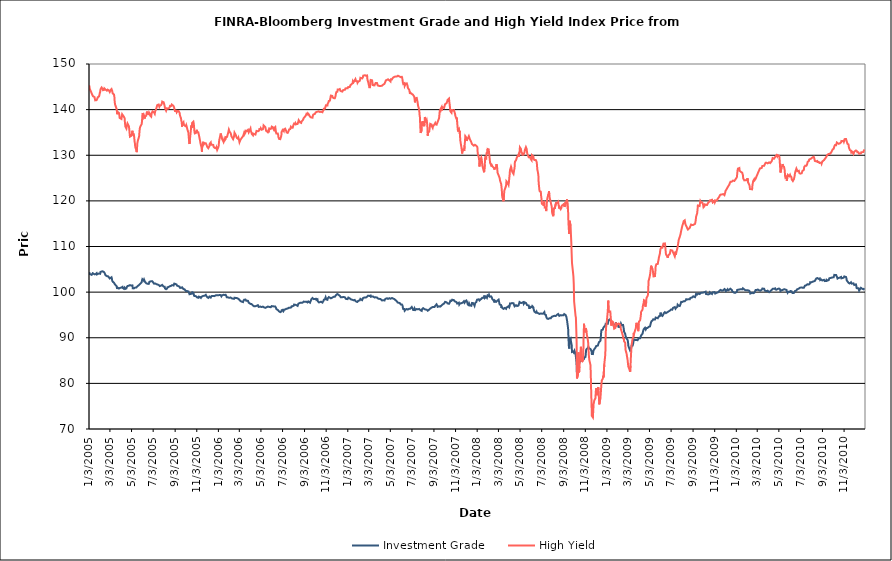
| Category | Investment Grade | High Yield |
|---|---|---|
| 1/3/05 | 104.343 | 145.319 |
| 1/4/05 | 104.16 | 145.238 |
| 1/5/05 | 103.953 | 144.493 |
| 1/6/05 | 103.965 | 144.467 |
| 1/7/05 | 103.905 | 144.3 |
| 1/10/05 | 103.794 | 143.584 |
| 1/11/05 | 103.889 | 143.363 |
| 1/12/05 | 103.941 | 143.402 |
| 1/13/05 | 104.147 | 143.307 |
| 1/14/05 | 104.036 | 142.917 |
| 1/18/05 | 103.9 | 142.755 |
| 1/19/05 | 103.971 | 142.839 |
| 1/20/05 | 103.872 | 142.037 |
| 1/21/05 | 103.955 | 142.079 |
| 1/24/05 | 104.155 | 142.083 |
| 1/25/05 | 103.882 | 142.243 |
| 1/26/05 | 103.91 | 142.393 |
| 1/27/05 | 103.804 | 142.681 |
| 1/28/05 | 104.02 | 142.831 |
| 1/31/05 | 104.076 | 142.911 |
| 2/1/05 | 104.105 | 143.28 |
| 2/2/05 | 104.086 | 143.652 |
| 2/3/05 | 104.023 | 143.894 |
| 2/4/05 | 104.432 | 144.453 |
| 2/7/05 | 104.534 | 144.856 |
| 2/8/05 | 104.605 | 145.058 |
| 2/9/05 | 104.703 | 144.888 |
| 2/10/05 | 104.553 | 144.576 |
| 2/11/05 | 104.372 | 144.26 |
| 2/14/05 | 104.388 | 144.325 |
| 2/15/05 | 104.316 | 144.638 |
| 2/16/05 | 104.11 | 144.653 |
| 2/17/05 | 104.001 | 144.691 |
| 2/18/05 | 103.711 | 144.428 |
| 2/22/05 | 103.506 | 144.154 |
| 2/23/05 | 103.591 | 144.264 |
| 2/24/05 | 103.55 | 144.379 |
| 2/25/05 | 103.494 | 144.395 |
| 2/28/05 | 103.216 | 144.178 |
| 3/1/05 | 103.056 | 143.99 |
| 3/2/05 | 102.987 | 143.881 |
| 3/3/05 | 103.029 | 144.062 |
| 3/4/05 | 103.116 | 144.252 |
| 3/7/05 | 103.25 | 144.509 |
| 3/8/05 | 102.962 | 144.692 |
| 3/9/05 | 102.474 | 144.096 |
| 3/10/05 | 102.35 | 143.614 |
| 3/11/05 | 102.247 | 143.544 |
| 3/14/05 | 102.07 | 143.289 |
| 3/15/05 | 102.076 | 142.877 |
| 3/16/05 | 101.771 | 141.686 |
| 3/17/05 | 101.795 | 141.163 |
| 3/18/05 | 101.648 | 141.33 |
| 3/21/05 | 101.327 | 140.239 |
| 3/22/05 | 101.163 | 139.79 |
| 3/23/05 | 100.692 | 138.992 |
| 3/24/05 | 100.993 | 139.53 |
| 3/28/05 | 100.794 | 139.271 |
| 3/29/05 | 100.755 | 138.872 |
| 3/30/05 | 100.79 | 138.18 |
| 3/31/05 | 100.924 | 138.075 |
| 4/1/05 | 101.005 | 138.121 |
| 4/4/05 | 100.997 | 137.948 |
| 4/5/05 | 101.011 | 138.478 |
| 4/6/05 | 101.142 | 138.984 |
| 4/7/05 | 101.153 | 139.179 |
| 4/8/05 | 100.905 | 138.973 |
| 4/11/05 | 100.728 | 138.447 |
| 4/12/05 | 100.833 | 138.264 |
| 4/13/05 | 100.987 | 138.087 |
| 4/14/05 | 100.848 | 137.054 |
| 4/15/05 | 100.719 | 136.307 |
| 4/18/05 | 100.819 | 135.863 |
| 4/19/05 | 101.064 | 136.344 |
| 4/20/05 | 101.222 | 136.698 |
| 4/21/05 | 101.333 | 136.97 |
| 4/22/05 | 101.438 | 136.784 |
| 4/25/05 | 101.411 | 136.346 |
| 4/26/05 | 101.292 | 135.795 |
| 4/27/05 | 101.393 | 134.855 |
| 4/28/05 | 101.534 | 134.082 |
| 4/29/05 | 101.518 | 133.92 |
| 5/2/05 | 101.434 | 134.257 |
| 5/3/05 | 101.437 | 134.479 |
| 5/4/05 | 101.517 | 134.874 |
| 5/5/05 | 101.474 | 135.374 |
| 5/6/05 | 100.841 | 134.515 |
| 5/9/05 | 100.817 | 134.576 |
| 5/10/05 | 100.958 | 133.973 |
| 5/11/05 | 101.002 | 133.106 |
| 5/12/05 | 100.982 | 132.594 |
| 5/13/05 | 100.991 | 131.802 |
| 5/16/05 | 100.997 | 131.095 |
| 5/17/05 | 100.968 | 130.681 |
| 5/18/05 | 101.209 | 131.588 |
| 5/19/05 | 101.278 | 132.647 |
| 5/20/05 | 101.283 | 133.102 |
| 5/23/05 | 101.524 | 133.904 |
| 5/24/05 | 101.56 | 134.234 |
| 5/25/05 | 101.682 | 135.291 |
| 5/26/05 | 101.75 | 135.927 |
| 5/27/05 | 101.884 | 136.236 |
| 5/31/05 | 102.135 | 136.819 |
| 6/1/05 | 102.564 | 137.407 |
| 6/2/05 | 102.824 | 138.734 |
| 6/3/05 | 102.759 | 139.268 |
| 6/6/05 | 102.485 | 138.39 |
| 6/7/05 | 102.722 | 138.651 |
| 6/8/05 | 102.605 | 138.419 |
| 6/9/05 | 102.331 | 138.056 |
| 6/10/05 | 102.181 | 138.523 |
| 6/13/05 | 101.942 | 138.668 |
| 6/14/05 | 101.869 | 139.172 |
| 6/15/05 | 101.82 | 139.575 |
| 6/16/05 | 101.844 | 139.078 |
| 6/17/05 | 101.944 | 139.134 |
| 6/20/05 | 101.804 | 138.985 |
| 6/21/05 | 101.971 | 139.358 |
| 6/22/05 | 102.258 | 139.44 |
| 6/23/05 | 102.224 | 139.083 |
| 6/24/05 | 102.29 | 138.705 |
| 6/27/05 | 102.4 | 138.474 |
| 6/28/05 | 102.305 | 139.087 |
| 6/29/05 | 102.305 | 139.337 |
| 6/30/05 | 102.402 | 139.466 |
| 7/1/05 | 102.272 | 139.626 |
| 7/5/05 | 101.849 | 139.378 |
| 7/6/05 | 101.878 | 139.345 |
| 7/7/05 | 102.04 | 139.091 |
| 7/8/05 | 101.907 | 139.585 |
| 7/11/05 | 101.773 | 140.154 |
| 7/12/05 | 101.766 | 140.43 |
| 7/13/05 | 101.644 | 140.407 |
| 7/14/05 | 101.677 | 140.998 |
| 7/15/05 | 101.633 | 141.09 |
| 7/18/05 | 101.59 | 141.117 |
| 7/19/05 | 101.526 | 140.91 |
| 7/20/05 | 101.5 | 140.611 |
| 7/21/05 | 101.33 | 140.778 |
| 7/22/05 | 101.432 | 140.902 |
| 7/25/05 | 101.437 | 140.996 |
| 7/26/05 | 101.403 | 141.12 |
| 7/27/05 | 101.39 | 141.347 |
| 7/28/05 | 101.579 | 141.763 |
| 7/29/05 | 101.463 | 141.838 |
| 8/1/05 | 101.202 | 141.62 |
| 8/2/05 | 101.174 | 141.521 |
| 8/3/05 | 101.163 | 141.075 |
| 8/4/05 | 101.172 | 140.984 |
| 8/5/05 | 100.786 | 140.33 |
| 8/8/05 | 100.645 | 139.783 |
| 8/9/05 | 100.599 | 139.917 |
| 8/10/05 | 100.742 | 140.274 |
| 8/11/05 | 100.806 | 140.187 |
| 8/12/05 | 101.068 | 140.232 |
| 8/15/05 | 101.123 | 140.269 |
| 8/16/05 | 101.264 | 140.227 |
| 8/17/05 | 101.171 | 140.27 |
| 8/18/05 | 101.27 | 140.515 |
| 8/19/05 | 101.292 | 140.821 |
| 8/22/05 | 101.371 | 140.818 |
| 8/23/05 | 101.482 | 140.994 |
| 8/24/05 | 101.47 | 141.119 |
| 8/25/05 | 101.538 | 141.139 |
| 8/26/05 | 101.472 | 141.246 |
| 8/29/05 | 101.447 | 140.777 |
| 8/30/05 | 101.539 | 140.657 |
| 8/31/05 | 101.866 | 140.362 |
| 9/1/05 | 101.904 | 139.957 |
| 9/2/05 | 101.902 | 139.694 |
| 9/6/05 | 101.702 | 139.738 |
| 9/7/05 | 101.484 | 139.424 |
| 9/8/05 | 101.412 | 139.603 |
| 9/9/05 | 101.507 | 139.675 |
| 9/12/05 | 101.289 | 139.702 |
| 9/13/05 | 101.436 | 139.589 |
| 9/14/05 | 101.41 | 139.7 |
| 9/15/05 | 101.198 | 139.326 |
| 9/16/05 | 100.947 | 138.769 |
| 9/19/05 | 100.92 | 138.093 |
| 9/20/05 | 100.822 | 137.577 |
| 9/21/05 | 101.051 | 137.279 |
| 9/22/05 | 101.06 | 136.264 |
| 9/23/05 | 100.888 | 136.991 |
| 9/26/05 | 100.662 | 137.266 |
| 9/27/05 | 100.587 | 136.765 |
| 9/28/05 | 100.636 | 136.654 |
| 9/29/05 | 100.615 | 136.516 |
| 9/30/05 | 100.474 | 136.425 |
| 10/3/05 | 100.22 | 136.319 |
| 10/4/05 | 100.251 | 136.573 |
| 10/5/05 | 100.289 | 136.315 |
| 10/6/05 | 100.233 | 136.152 |
| 10/7/05 | 100.127 | 135.697 |
| 10/10/05 | 100.145 | 134.892 |
| 10/11/05 | 100.026 | 133.876 |
| 10/12/05 | 99.822 | 132.974 |
| 10/13/05 | 99.537 | 132.463 |
| 10/14/05 | 99.464 | 133.309 |
| 10/17/05 | 99.614 | 135.611 |
| 10/18/05 | 99.713 | 136.523 |
| 10/19/05 | 99.754 | 135.961 |
| 10/20/05 | 99.661 | 136.123 |
| 10/21/05 | 99.956 | 137.128 |
| 10/24/05 | 99.836 | 137.356 |
| 10/25/05 | 99.592 | 136.993 |
| 10/26/05 | 99.18 | 136.092 |
| 10/27/05 | 99.14 | 135.099 |
| 10/28/05 | 99.125 | 134.797 |
| 10/31/05 | 99.119 | 134.881 |
| 11/1/05 | 99.121 | 135.143 |
| 11/2/05 | 98.98 | 135.174 |
| 11/3/05 | 98.854 | 135.576 |
| 11/4/05 | 98.764 | 135.017 |
| 11/7/05 | 98.766 | 134.988 |
| 11/8/05 | 99.01 | 134.818 |
| 11/9/05 | 98.804 | 134.245 |
| 11/10/05 | 98.864 | 134.131 |
| 11/11/05 | 98.953 | 134.291 |
| 11/14/05 | 98.73 | 132.27 |
| 11/15/05 | 98.801 | 132.254 |
| 11/16/05 | 98.997 | 131.705 |
| 11/17/05 | 99.065 | 130.783 |
| 11/18/05 | 99.041 | 132.286 |
| 11/21/05 | 99.171 | 132.957 |
| 11/22/05 | 99.212 | 132.367 |
| 11/23/05 | 99.198 | 132.411 |
| 11/25/05 | 99.235 | 132.644 |
| 11/28/05 | 99.42 | 132.63 |
| 11/29/05 | 99.257 | 132.62 |
| 11/30/05 | 99.115 | 132.297 |
| 12/1/05 | 98.992 | 132.407 |
| 12/2/05 | 98.894 | 131.85 |
| 12/5/05 | 98.733 | 131.549 |
| 12/6/05 | 98.856 | 131.356 |
| 12/7/05 | 98.834 | 131.464 |
| 12/8/05 | 99.024 | 131.968 |
| 12/9/05 | 98.906 | 132.51 |
| 12/12/05 | 98.804 | 132.801 |
| 12/13/05 | 98.83 | 132.291 |
| 12/14/05 | 99.128 | 132.316 |
| 12/15/05 | 99.066 | 132.169 |
| 12/16/05 | 99.224 | 132.304 |
| 12/19/05 | 99.169 | 132.267 |
| 12/20/05 | 99.075 | 131.868 |
| 12/21/05 | 98.95 | 131.72 |
| 12/22/05 | 99.125 | 131.704 |
| 12/23/05 | 99.216 | 131.622 |
| 12/27/05 | 99.333 | 131.516 |
| 12/28/05 | 99.401 | 131.738 |
| 12/29/05 | 99.364 | 131.468 |
| 12/30/05 | 99.341 | 131.173 |
| 1/3/06 | 99.332 | 131.91 |
| 1/4/06 | 99.423 | 132.671 |
| 1/5/06 | 99.426 | 133.413 |
| 1/6/06 | 99.355 | 133.643 |
| 1/9/06 | 99.342 | 134.769 |
| 1/10/06 | 99.168 | 134.514 |
| 1/11/06 | 99.068 | 134.516 |
| 1/12/06 | 99.117 | 134.05 |
| 1/13/06 | 99.303 | 133.555 |
| 1/17/06 | 99.418 | 132.919 |
| 1/18/06 | 99.47 | 132.896 |
| 1/19/06 | 99.38 | 133.5 |
| 1/20/06 | 99.385 | 133.224 |
| 1/23/06 | 99.412 | 133.552 |
| 1/24/06 | 99.361 | 134.001 |
| 1/25/06 | 99.136 | 134.216 |
| 1/26/06 | 98.879 | 133.879 |
| 1/27/06 | 98.914 | 134.031 |
| 1/30/06 | 98.837 | 134.921 |
| 1/31/06 | 98.854 | 135.056 |
| 2/1/06 | 98.784 | 135.605 |
| 2/2/06 | 98.763 | 135.593 |
| 2/3/06 | 98.724 | 135.146 |
| 2/6/06 | 98.816 | 134.868 |
| 2/7/06 | 98.733 | 134.621 |
| 2/8/06 | 98.645 | 134.208 |
| 2/9/06 | 98.64 | 134.181 |
| 2/10/06 | 98.662 | 134.009 |
| 2/13/06 | 98.555 | 133.522 |
| 2/14/06 | 98.484 | 133.371 |
| 2/15/06 | 98.517 | 133.944 |
| 2/16/06 | 98.548 | 134.37 |
| 2/17/06 | 98.771 | 134.946 |
| 2/21/06 | 98.715 | 134.36 |
| 2/22/06 | 98.754 | 134.06 |
| 2/23/06 | 98.712 | 133.867 |
| 2/24/06 | 98.69 | 133.755 |
| 2/27/06 | 98.58 | 133.591 |
| 2/28/06 | 98.7 | 133.818 |
| 3/1/06 | 98.619 | 133.744 |
| 3/2/06 | 98.393 | 133.236 |
| 3/3/06 | 98.233 | 132.854 |
| 3/6/06 | 98.027 | 133.424 |
| 3/7/06 | 97.9 | 133.306 |
| 3/8/06 | 97.914 | 133.36 |
| 3/9/06 | 97.925 | 133.753 |
| 3/10/06 | 97.826 | 133.911 |
| 3/13/06 | 97.825 | 134.181 |
| 3/14/06 | 98.069 | 134.261 |
| 3/15/06 | 98.031 | 134.615 |
| 3/16/06 | 98.334 | 134.881 |
| 3/17/06 | 98.304 | 134.585 |
| 3/20/06 | 98.374 | 134.992 |
| 3/21/06 | 98.16 | 135.372 |
| 3/22/06 | 98.121 | 135.408 |
| 3/23/06 | 98.025 | 135.266 |
| 3/24/06 | 98.152 | 135.325 |
| 3/27/06 | 98.086 | 135.566 |
| 3/28/06 | 97.884 | 135.439 |
| 3/29/06 | 97.681 | 135.023 |
| 3/30/06 | 97.491 | 135.011 |
| 3/31/06 | 97.495 | 135.344 |
| 4/3/06 | 97.42 | 135.864 |
| 4/4/06 | 97.477 | 135.367 |
| 4/5/06 | 97.561 | 135.307 |
| 4/6/06 | 97.382 | 134.94 |
| 4/7/06 | 97.167 | 134.616 |
| 4/10/06 | 97.082 | 134.377 |
| 4/11/06 | 97.195 | 134.732 |
| 4/12/06 | 97.139 | 134.682 |
| 4/13/06 | 96.899 | 134.528 |
| 4/17/06 | 96.918 | 134.532 |
| 4/18/06 | 97.079 | 134.825 |
| 4/19/06 | 96.987 | 135.023 |
| 4/20/06 | 96.989 | 135.333 |
| 4/21/06 | 97.03 | 135.37 |
| 4/24/06 | 97.134 | 135.246 |
| 4/25/06 | 96.925 | 135.13 |
| 4/26/06 | 96.768 | 135.162 |
| 4/27/06 | 96.868 | 135.4 |
| 4/28/06 | 96.956 | 135.727 |
| 5/1/06 | 96.839 | 135.689 |
| 5/2/06 | 96.897 | 135.92 |
| 5/3/06 | 96.782 | 135.783 |
| 5/4/06 | 96.728 | 135.594 |
| 5/5/06 | 96.852 | 135.628 |
| 5/8/06 | 96.821 | 135.7 |
| 5/9/06 | 96.771 | 135.944 |
| 5/10/06 | 96.85 | 136.533 |
| 5/11/06 | 96.666 | 136.702 |
| 5/12/06 | 96.512 | 136.451 |
| 5/15/06 | 96.56 | 136.151 |
| 5/16/06 | 96.663 | 135.992 |
| 5/17/06 | 96.444 | 135.376 |
| 5/18/06 | 96.661 | 135.253 |
| 5/19/06 | 96.809 | 135.488 |
| 5/22/06 | 96.842 | 135.04 |
| 5/23/06 | 96.721 | 135.278 |
| 5/24/06 | 96.817 | 135.015 |
| 5/25/06 | 96.772 | 135.527 |
| 5/26/06 | 96.824 | 135.874 |
| 5/30/06 | 96.702 | 135.75 |
| 5/31/06 | 96.557 | 135.857 |
| 6/1/06 | 96.521 | 135.974 |
| 6/2/06 | 96.939 | 136.277 |
| 6/5/06 | 96.909 | 136.162 |
| 6/6/06 | 96.825 | 135.866 |
| 6/7/06 | 96.792 | 136.05 |
| 6/8/06 | 96.861 | 135.592 |
| 6/9/06 | 96.9 | 135.922 |
| 6/12/06 | 96.861 | 136.181 |
| 6/13/06 | 96.87 | 135.599 |
| 6/14/06 | 96.555 | 135.028 |
| 6/15/06 | 96.273 | 134.781 |
| 6/16/06 | 96.267 | 134.748 |
| 6/19/06 | 96.104 | 134.776 |
| 6/20/06 | 96.031 | 134.452 |
| 6/21/06 | 95.986 | 133.884 |
| 6/22/06 | 95.822 | 133.84 |
| 6/23/06 | 95.681 | 133.56 |
| 6/26/06 | 95.62 | 133.532 |
| 6/27/06 | 95.703 | 133.65 |
| 6/28/06 | 95.641 | 133.654 |
| 6/29/06 | 95.747 | 134.285 |
| 6/30/06 | 96.039 | 135.161 |
| 7/3/06 | 96.128 | 135.559 |
| 7/5/06 | 95.843 | 135.346 |
| 7/6/06 | 95.945 | 135.276 |
| 7/7/06 | 96.141 | 135.692 |
| 7/10/06 | 96.214 | 135.821 |
| 7/11/06 | 96.32 | 135.822 |
| 7/12/06 | 96.254 | 135.806 |
| 7/13/06 | 96.347 | 135.251 |
| 7/14/06 | 96.422 | 134.996 |
| 7/17/06 | 96.402 | 134.909 |
| 7/18/06 | 96.209 | 134.957 |
| 7/19/06 | 96.395 | 135.186 |
| 7/20/06 | 96.565 | 135.327 |
| 7/21/06 | 96.664 | 135.653 |
| 7/24/06 | 96.596 | 135.738 |
| 7/25/06 | 96.491 | 135.87 |
| 7/26/06 | 96.567 | 136.235 |
| 7/27/06 | 96.661 | 136.224 |
| 7/28/06 | 96.883 | 136.006 |
| 7/31/06 | 96.92 | 136.009 |
| 8/1/06 | 96.923 | 136.092 |
| 8/2/06 | 97.018 | 136.603 |
| 8/3/06 | 97.027 | 136.449 |
| 8/4/06 | 97.267 | 136.938 |
| 8/7/06 | 97.242 | 136.797 |
| 8/8/06 | 97.219 | 137.055 |
| 8/9/06 | 97.171 | 137.159 |
| 8/10/06 | 97.157 | 136.8 |
| 8/11/06 | 97.085 | 136.829 |
| 8/14/06 | 96.986 | 136.863 |
| 8/15/06 | 97.202 | 137.078 |
| 8/16/06 | 97.457 | 137.409 |
| 8/17/06 | 97.521 | 137.686 |
| 8/18/06 | 97.558 | 137.545 |
| 8/21/06 | 97.648 | 137.195 |
| 8/22/06 | 97.662 | 137.044 |
| 8/23/06 | 97.61 | 137.088 |
| 8/24/06 | 97.665 | 137.091 |
| 8/25/06 | 97.746 | 137.394 |
| 8/28/06 | 97.693 | 137.636 |
| 8/29/06 | 97.604 | 137.617 |
| 8/30/06 | 97.793 | 137.88 |
| 8/31/06 | 97.923 | 138.137 |
| 9/1/06 | 97.951 | 138.244 |
| 9/5/06 | 97.876 | 138.577 |
| 9/6/06 | 97.691 | 138.719 |
| 9/7/06 | 97.739 | 138.856 |
| 9/8/06 | 97.887 | 139.096 |
| 9/11/06 | 97.742 | 138.947 |
| 9/12/06 | 97.779 | 139.175 |
| 9/13/06 | 97.963 | 139.285 |
| 9/14/06 | 97.871 | 139.265 |
| 9/15/06 | 97.82 | 138.905 |
| 9/18/06 | 97.678 | 138.451 |
| 9/19/06 | 97.913 | 138.516 |
| 9/20/06 | 98.04 | 138.56 |
| 9/21/06 | 98.243 | 138.289 |
| 9/22/06 | 98.489 | 138.323 |
| 9/25/06 | 98.722 | 138.238 |
| 9/26/06 | 98.656 | 138.667 |
| 9/27/06 | 98.611 | 138.912 |
| 9/28/06 | 98.47 | 138.841 |
| 9/29/06 | 98.438 | 139.002 |
| 10/2/06 | 98.507 | 139.074 |
| 10/3/06 | 98.491 | 138.914 |
| 10/4/06 | 98.652 | 139.406 |
| 10/5/06 | 98.543 | 139.481 |
| 10/6/06 | 98.307 | 139.486 |
| 10/9/06 | 98.423 | 139.553 |
| 10/10/06 | 97.968 | 139.383 |
| 10/11/06 | 97.902 | 139.542 |
| 10/12/06 | 97.87 | 139.631 |
| 10/13/06 | 97.745 | 139.615 |
| 10/16/06 | 97.818 | 139.487 |
| 10/17/06 | 97.981 | 139.484 |
| 10/18/06 | 97.951 | 139.527 |
| 10/19/06 | 97.902 | 139.555 |
| 10/20/06 | 97.849 | 139.49 |
| 10/23/06 | 97.705 | 139.428 |
| 10/24/06 | 97.702 | 139.652 |
| 10/25/06 | 97.832 | 139.615 |
| 10/26/06 | 98.1 | 139.885 |
| 10/27/06 | 98.343 | 140.207 |
| 10/30/06 | 98.414 | 140.217 |
| 10/31/06 | 98.608 | 140.355 |
| 11/1/06 | 98.868 | 140.745 |
| 11/2/06 | 98.822 | 140.965 |
| 11/3/06 | 98.398 | 140.89 |
| 11/6/06 | 98.326 | 140.907 |
| 11/7/06 | 98.651 | 141.33 |
| 11/8/06 | 98.65 | 141.296 |
| 11/9/06 | 98.743 | 141.59 |
| 11/10/06 | 98.913 | 141.896 |
| 11/13/06 | 98.785 | 141.972 |
| 11/14/06 | 98.925 | 142.35 |
| 11/15/06 | 98.775 | 142.827 |
| 11/16/06 | 98.642 | 143.086 |
| 11/17/06 | 98.773 | 143.029 |
| 11/20/06 | 98.814 | 142.99 |
| 11/21/06 | 98.865 | 142.652 |
| 11/22/06 | 98.981 | 142.508 |
| 11/24/06 | 98.982 | 142.519 |
| 11/27/06 | 98.979 | 142.501 |
| 11/28/06 | 99.161 | 142.411 |
| 11/29/06 | 99.192 | 142.998 |
| 11/30/06 | 99.326 | 143.488 |
| 12/1/06 | 99.534 | 143.821 |
| 12/4/06 | 99.584 | 143.934 |
| 12/5/06 | 99.621 | 144.395 |
| 12/6/06 | 99.503 | 144.546 |
| 12/7/06 | 99.429 | 144.572 |
| 12/8/06 | 99.245 | 144.394 |
| 12/11/06 | 99.204 | 144.516 |
| 12/12/06 | 99.271 | 144.445 |
| 12/13/06 | 99.022 | 144.098 |
| 12/14/06 | 98.856 | 143.879 |
| 12/15/06 | 98.982 | 144.131 |
| 12/18/06 | 98.88 | 143.954 |
| 12/19/06 | 98.899 | 144.126 |
| 12/20/06 | 98.874 | 144.255 |
| 12/21/06 | 98.943 | 144.438 |
| 12/22/06 | 98.87 | 144.462 |
| 12/26/06 | 98.839 | 144.384 |
| 12/27/06 | 98.696 | 144.657 |
| 12/28/06 | 98.533 | 144.677 |
| 12/29/06 | 98.449 | 144.601 |
| 1/2/07 | 98.465 | 144.668 |
| 1/3/07 | 98.587 | 144.92 |
| 1/4/07 | 98.809 | 144.932 |
| 1/5/07 | 98.665 | 144.953 |
| 1/8/07 | 98.638 | 144.962 |
| 1/9/07 | 98.658 | 145.135 |
| 1/10/07 | 98.552 | 145.368 |
| 1/11/07 | 98.416 | 145.398 |
| 1/12/07 | 98.198 | 145.502 |
| 1/16/07 | 98.31 | 145.767 |
| 1/17/07 | 98.281 | 146.259 |
| 1/18/07 | 98.233 | 146.131 |
| 1/19/07 | 98.211 | 146.012 |
| 1/22/07 | 98.289 | 146.407 |
| 1/23/07 | 98.217 | 146.58 |
| 1/24/07 | 98.167 | 146.695 |
| 1/25/07 | 97.99 | 146.531 |
| 1/26/07 | 97.867 | 146.244 |
| 1/29/07 | 97.85 | 146.217 |
| 1/30/07 | 97.836 | 145.879 |
| 1/31/07 | 97.925 | 145.748 |
| 2/1/07 | 98.081 | 146.134 |
| 2/2/07 | 98.126 | 146.246 |
| 2/5/07 | 98.191 | 146.298 |
| 2/6/07 | 98.308 | 146.519 |
| 2/7/07 | 98.518 | 146.972 |
| 2/8/07 | 98.51 | 146.816 |
| 2/9/07 | 98.362 | 147.071 |
| 2/12/07 | 98.248 | 146.834 |
| 2/13/07 | 98.172 | 146.779 |
| 2/14/07 | 98.461 | 147.057 |
| 2/15/07 | 98.75 | 147.448 |
| 2/16/07 | 98.821 | 147.477 |
| 2/20/07 | 98.847 | 147.545 |
| 2/21/07 | 98.819 | 147.704 |
| 2/22/07 | 98.693 | 147.746 |
| 2/23/07 | 98.834 | 147.43 |
| 2/26/07 | 99.001 | 147.489 |
| 2/27/07 | 99.183 | 146.525 |
| 2/28/07 | 99.173 | 146.557 |
| 3/1/07 | 99.224 | 146.088 |
| 3/2/07 | 99.245 | 145.71 |
| 3/5/07 | 99.16 | 144.718 |
| 3/6/07 | 99.097 | 144.993 |
| 3/7/07 | 99.186 | 145.827 |
| 3/8/07 | 99.252 | 146.502 |
| 3/9/07 | 98.98 | 146.547 |
| 3/12/07 | 99.061 | 146.431 |
| 3/13/07 | 99.17 | 145.894 |
| 3/14/07 | 99.06 | 145.169 |
| 3/15/07 | 99.029 | 145.458 |
| 3/16/07 | 98.968 | 145.336 |
| 3/19/07 | 98.828 | 145.335 |
| 3/20/07 | 98.868 | 145.292 |
| 3/21/07 | 98.881 | 145.535 |
| 3/22/07 | 98.865 | 145.832 |
| 3/23/07 | 98.777 | 145.939 |
| 3/26/07 | 98.811 | 145.819 |
| 3/27/07 | 98.702 | 145.639 |
| 3/28/07 | 98.711 | 145.296 |
| 3/29/07 | 98.576 | 145.353 |
| 3/30/07 | 98.488 | 145.321 |
| 4/2/07 | 98.518 | 145.174 |
| 4/3/07 | 98.453 | 145.217 |
| 4/4/07 | 98.487 | 144.999 |
| 4/5/07 | 98.486 | 145.174 |
| 4/9/07 | 98.159 | 145.244 |
| 4/10/07 | 98.258 | 145.27 |
| 4/11/07 | 98.306 | 145.459 |
| 4/12/07 | 98.24 | 145.454 |
| 4/13/07 | 98.118 | 145.498 |
| 4/16/07 | 98.168 | 145.666 |
| 4/17/07 | 98.395 | 145.866 |
| 4/18/07 | 98.583 | 146.01 |
| 4/19/07 | 98.595 | 146.154 |
| 4/20/07 | 98.571 | 146.415 |
| 4/23/07 | 98.656 | 146.507 |
| 4/24/07 | 98.774 | 146.539 |
| 4/25/07 | 98.679 | 146.501 |
| 4/26/07 | 98.524 | 146.652 |
| 4/27/07 | 98.432 | 146.533 |
| 4/30/07 | 98.673 | 146.379 |
| 5/1/07 | 98.646 | 146.282 |
| 5/2/07 | 98.654 | 146.44 |
| 5/3/07 | 98.552 | 146.149 |
| 5/4/07 | 98.693 | 146.645 |
| 5/7/07 | 98.709 | 146.626 |
| 5/8/07 | 98.736 | 146.732 |
| 5/9/07 | 98.636 | 146.796 |
| 5/10/07 | 98.595 | 146.986 |
| 5/11/07 | 98.609 | 146.977 |
| 5/14/07 | 98.477 | 147.209 |
| 5/15/07 | 98.445 | 147.309 |
| 5/16/07 | 98.405 | 147.207 |
| 5/17/07 | 98.251 | 147.237 |
| 5/18/07 | 98.106 | 147.26 |
| 5/21/07 | 97.983 | 147.276 |
| 5/22/07 | 97.916 | 147.294 |
| 5/23/07 | 97.734 | 147.484 |
| 5/24/07 | 97.666 | 147.434 |
| 5/25/07 | 97.738 | 147.412 |
| 5/29/07 | 97.618 | 147.247 |
| 5/30/07 | 97.576 | 147.044 |
| 5/31/07 | 97.438 | 147.063 |
| 6/1/07 | 97.285 | 147.121 |
| 6/4/07 | 97.29 | 147.188 |
| 6/5/07 | 97.122 | 146.965 |
| 6/6/07 | 97.06 | 146.756 |
| 6/7/07 | 96.556 | 145.937 |
| 6/8/07 | 96.291 | 145.624 |
| 6/11/07 | 96.312 | 145.765 |
| 6/12/07 | 95.934 | 145.197 |
| 6/13/07 | 95.93 | 145.11 |
| 6/14/07 | 96.014 | 145.348 |
| 6/15/07 | 96.176 | 145.704 |
| 6/18/07 | 96.296 | 145.762 |
| 6/19/07 | 96.482 | 145.61 |
| 6/20/07 | 96.371 | 145.259 |
| 6/21/07 | 96.174 | 144.777 |
| 6/22/07 | 96.137 | 144.766 |
| 6/25/07 | 96.379 | 144.304 |
| 6/26/07 | 96.366 | 144.095 |
| 6/27/07 | 96.444 | 143.429 |
| 6/28/07 | 96.372 | 143.727 |
| 6/29/07 | 96.548 | 143.682 |
| 7/2/07 | 96.737 | 143.454 |
| 7/3/07 | 96.786 | 143.562 |
| 7/5/07 | 96.322 | 143.295 |
| 7/6/07 | 96.083 | 143.101 |
| 7/9/07 | 96.098 | 142.851 |
| 7/10/07 | 96.403 | 142.247 |
| 7/11/07 | 96.324 | 141.594 |
| 7/12/07 | 96.09 | 142.119 |
| 7/13/07 | 96.133 | 142.498 |
| 7/16/07 | 96.301 | 142.561 |
| 7/17/07 | 96.271 | 142.417 |
| 7/18/07 | 96.316 | 141.777 |
| 7/19/07 | 96.225 | 141.716 |
| 7/20/07 | 96.441 | 140.781 |
| 7/23/07 | 96.319 | 139.964 |
| 7/24/07 | 96.28 | 138.848 |
| 7/25/07 | 96.275 | 138.309 |
| 7/26/07 | 96.064 | 136.246 |
| 7/27/07 | 95.998 | 134.898 |
| 7/30/07 | 95.9 | 135.48 |
| 7/31/07 | 96.239 | 137.335 |
| 8/1/07 | 96.29 | 136.402 |
| 8/2/07 | 96.353 | 137.453 |
| 8/3/07 | 96.487 | 137.113 |
| 8/6/07 | 96.32 | 136.358 |
| 8/7/07 | 96.326 | 136.946 |
| 8/8/07 | 96.113 | 138.373 |
| 8/9/07 | 96.2 | 138.071 |
| 8/10/07 | 96.054 | 137.172 |
| 8/13/07 | 96.148 | 137.7 |
| 8/14/07 | 96.194 | 137.207 |
| 8/15/07 | 96.035 | 136.217 |
| 8/16/07 | 95.911 | 134.291 |
| 8/17/07 | 96.011 | 135.078 |
| 8/20/07 | 96.18 | 135.154 |
| 8/21/07 | 96.326 | 135.226 |
| 8/22/07 | 96.24 | 136.211 |
| 8/23/07 | 96.386 | 136.87 |
| 8/24/07 | 96.444 | 136.852 |
| 8/27/07 | 96.62 | 136.716 |
| 8/28/07 | 96.701 | 136.321 |
| 8/29/07 | 96.654 | 136.261 |
| 8/30/07 | 96.723 | 136.004 |
| 8/31/07 | 96.787 | 136.353 |
| 9/4/07 | 96.723 | 136.755 |
| 9/5/07 | 96.911 | 136.912 |
| 9/6/07 | 96.808 | 137.051 |
| 9/7/07 | 97.08 | 136.782 |
| 9/10/07 | 97.328 | 136.701 |
| 9/11/07 | 97.198 | 136.565 |
| 9/12/07 | 97.023 | 136.754 |
| 9/13/07 | 96.779 | 137.31 |
| 9/14/07 | 96.86 | 137.532 |
| 9/17/07 | 96.903 | 138.097 |
| 9/18/07 | 96.968 | 138.904 |
| 9/19/07 | 97.117 | 139.807 |
| 9/20/07 | 96.805 | 139.446 |
| 9/21/07 | 96.948 | 140.104 |
| 9/24/07 | 97.088 | 140.525 |
| 9/25/07 | 97.156 | 139.817 |
| 9/26/07 | 97.064 | 140.559 |
| 9/27/07 | 97.303 | 140.621 |
| 9/28/07 | 97.422 | 140.394 |
| 10/1/07 | 97.487 | 140.373 |
| 10/2/07 | 97.666 | 140.626 |
| 10/3/07 | 97.673 | 140.765 |
| 10/4/07 | 97.867 | 141.2 |
| 10/5/07 | 97.688 | 141.401 |
| 10/8/07 | 97.771 | 141.413 |
| 10/9/07 | 97.586 | 141.527 |
| 10/10/07 | 97.583 | 141.765 |
| 10/11/07 | 97.526 | 142.141 |
| 10/12/07 | 97.501 | 142.244 |
| 10/15/07 | 97.443 | 142.435 |
| 10/16/07 | 97.531 | 141.652 |
| 10/17/07 | 97.69 | 141.076 |
| 10/18/07 | 97.863 | 140.327 |
| 10/19/07 | 98.138 | 139.61 |
| 10/22/07 | 98.077 | 139.318 |
| 10/23/07 | 98.105 | 140.108 |
| 10/24/07 | 98.341 | 139.785 |
| 10/25/07 | 98.303 | 139.989 |
| 10/26/07 | 98.216 | 139.813 |
| 10/29/07 | 98.234 | 139.886 |
| 10/30/07 | 98.224 | 139.676 |
| 10/31/07 | 97.987 | 139.824 |
| 11/1/07 | 98.02 | 139.101 |
| 11/2/07 | 98.034 | 138.603 |
| 11/5/07 | 97.827 | 138.018 |
| 11/6/07 | 97.652 | 138.268 |
| 11/7/07 | 97.492 | 137.31 |
| 11/8/07 | 97.381 | 136.333 |
| 11/9/07 | 97.483 | 135.544 |
| 11/12/07 | 97.684 | 135.801 |
| 11/13/07 | 97.278 | 135.11 |
| 11/14/07 | 97.34 | 135.355 |
| 11/15/07 | 97.517 | 134.342 |
| 11/16/07 | 97.584 | 133.17 |
| 11/19/07 | 97.577 | 131.759 |
| 11/20/07 | 97.548 | 131.194 |
| 11/21/07 | 97.697 | 130.379 |
| 11/23/07 | 97.707 | 131.273 |
| 11/26/07 | 97.992 | 131.296 |
| 11/27/07 | 97.873 | 130.948 |
| 11/28/07 | 97.683 | 132.159 |
| 11/29/07 | 97.89 | 132.948 |
| 11/30/07 | 97.985 | 134.189 |
| 12/3/07 | 98.17 | 133.857 |
| 12/4/07 | 98.058 | 133.162 |
| 12/5/07 | 97.86 | 133.385 |
| 12/6/07 | 97.59 | 133.193 |
| 12/7/07 | 97.275 | 133.688 |
| 12/10/07 | 97.122 | 134.192 |
| 12/11/07 | 97.476 | 134.3 |
| 12/12/07 | 97.332 | 134.163 |
| 12/13/07 | 97.109 | 133.505 |
| 12/14/07 | 96.916 | 133.307 |
| 12/17/07 | 97.008 | 132.844 |
| 12/18/07 | 97.304 | 132.854 |
| 12/19/07 | 97.557 | 132.434 |
| 12/20/07 | 97.823 | 132.495 |
| 12/21/07 | 97.464 | 132.432 |
| 12/24/07 | 97.356 | 132.102 |
| 12/26/07 | 97.009 | 132.059 |
| 12/27/07 | 97.176 | 132.288 |
| 12/28/07 | 97.614 | 132.098 |
| 12/31/07 | 97.814 | 132.077 |
| 1/2/08 | 98.337 | 132.293 |
| 1/3/08 | 98.358 | 131.799 |
| 1/4/08 | 98.524 | 130.434 |
| 1/7/08 | 98.436 | 129.561 |
| 1/8/08 | 98.305 | 128.956 |
| 1/9/08 | 98.174 | 127.53 |
| 1/10/08 | 98.058 | 128.298 |
| 1/11/08 | 98.376 | 128.78 |
| 1/14/08 | 98.517 | 129.494 |
| 1/15/08 | 98.694 | 129.211 |
| 1/16/08 | 98.695 | 128.559 |
| 1/17/08 | 98.751 | 127.724 |
| 1/18/08 | 98.633 | 127.936 |
| 1/22/08 | 98.77 | 126.27 |
| 1/23/08 | 99.273 | 126.228 |
| 1/24/08 | 98.707 | 127.975 |
| 1/25/08 | 98.86 | 129.489 |
| 1/28/08 | 98.969 | 129.313 |
| 1/29/08 | 98.823 | 130.425 |
| 1/30/08 | 98.743 | 130.71 |
| 1/31/08 | 99.005 | 130.356 |
| 2/1/08 | 99.286 | 131.379 |
| 2/4/08 | 99.139 | 131.284 |
| 2/5/08 | 99.394 | 130.53 |
| 2/6/08 | 99.316 | 129.842 |
| 2/7/08 | 98.995 | 129.054 |
| 2/8/08 | 98.938 | 128.292 |
| 2/11/08 | 99.055 | 127.834 |
| 2/12/08 | 98.842 | 127.526 |
| 2/13/08 | 98.759 | 127.812 |
| 2/14/08 | 98.506 | 128.015 |
| 2/15/08 | 98.48 | 127.496 |
| 2/19/08 | 98.065 | 127.216 |
| 2/20/08 | 97.734 | 126.86 |
| 2/21/08 | 98.151 | 127.118 |
| 2/22/08 | 98.308 | 127.087 |
| 2/25/08 | 97.881 | 127.442 |
| 2/26/08 | 97.785 | 128.038 |
| 2/27/08 | 97.922 | 127.971 |
| 2/28/08 | 98.104 | 127.117 |
| 2/29/08 | 98.304 | 126.172 |
| 3/3/08 | 98.352 | 125.588 |
| 3/4/08 | 98.01 | 125.372 |
| 3/5/08 | 97.579 | 125.599 |
| 3/6/08 | 97.296 | 124.984 |
| 3/7/08 | 97.268 | 124.421 |
| 3/10/08 | 97.154 | 123.76 |
| 3/11/08 | 96.527 | 123.134 |
| 3/12/08 | 96.766 | 122.372 |
| 3/13/08 | 96.631 | 120.939 |
| 3/14/08 | 96.461 | 120.942 |
| 3/17/08 | 96.334 | 119.921 |
| 3/18/08 | 96.297 | 121.114 |
| 3/19/08 | 96.436 | 122.177 |
| 3/20/08 | 96.528 | 122.053 |
| 3/24/08 | 96.345 | 123.33 |
| 3/25/08 | 96.627 | 124.299 |
| 3/26/08 | 96.718 | 124.484 |
| 3/27/08 | 96.626 | 124.415 |
| 3/28/08 | 96.725 | 124.025 |
| 3/31/08 | 96.93 | 123.51 |
| 4/1/08 | 96.733 | 124.086 |
| 4/2/08 | 96.681 | 124.971 |
| 4/3/08 | 96.904 | 125.651 |
| 4/4/08 | 97.511 | 126.698 |
| 4/7/08 | 97.51 | 127.501 |
| 4/8/08 | 97.52 | 127.264 |
| 4/9/08 | 97.663 | 126.784 |
| 4/10/08 | 97.601 | 126.514 |
| 4/11/08 | 97.682 | 126.279 |
| 4/14/08 | 97.563 | 125.906 |
| 4/15/08 | 97.328 | 126.02 |
| 4/16/08 | 97.135 | 126.838 |
| 4/17/08 | 96.893 | 127.234 |
| 4/18/08 | 96.825 | 128.596 |
| 4/21/08 | 97.135 | 128.905 |
| 4/22/08 | 97.274 | 129.136 |
| 4/23/08 | 97.26 | 129.434 |
| 4/24/08 | 96.953 | 129.446 |
| 4/25/08 | 96.919 | 129.6 |
| 4/28/08 | 97.06 | 130.166 |
| 4/29/08 | 97.332 | 129.693 |
| 4/30/08 | 97.527 | 130.093 |
| 5/1/08 | 97.824 | 130.518 |
| 5/2/08 | 97.661 | 131.72 |
| 5/5/08 | 97.608 | 131.372 |
| 5/6/08 | 97.515 | 130.782 |
| 5/7/08 | 97.444 | 130.624 |
| 5/8/08 | 97.675 | 130.508 |
| 5/9/08 | 97.876 | 130.119 |
| 5/12/08 | 97.82 | 130.1 |
| 5/13/08 | 97.428 | 130.119 |
| 5/14/08 | 97.243 | 130.183 |
| 5/15/08 | 97.393 | 130.66 |
| 5/16/08 | 97.747 | 131.142 |
| 5/19/08 | 97.633 | 131.778 |
| 5/20/08 | 97.729 | 131.603 |
| 5/21/08 | 97.645 | 131.401 |
| 5/22/08 | 97.16 | 130.774 |
| 5/23/08 | 97.326 | 130.321 |
| 5/27/08 | 97.058 | 129.562 |
| 5/28/08 | 96.717 | 129.577 |
| 5/29/08 | 96.344 | 129.674 |
| 5/30/08 | 96.618 | 129.614 |
| 6/2/08 | 96.776 | 129.144 |
| 6/3/08 | 96.823 | 128.928 |
| 6/4/08 | 96.966 | 128.918 |
| 6/5/08 | 96.689 | 130.034 |
| 6/6/08 | 96.934 | 129.935 |
| 6/9/08 | 96.667 | 129.754 |
| 6/10/08 | 96.181 | 129.199 |
| 6/11/08 | 96.106 | 129.031 |
| 6/12/08 | 95.726 | 128.947 |
| 6/13/08 | 95.637 | 128.871 |
| 6/16/08 | 95.49 | 128.941 |
| 6/17/08 | 95.599 | 129.027 |
| 6/18/08 | 95.735 | 128.631 |
| 6/19/08 | 95.5 | 128.104 |
| 6/20/08 | 95.542 | 126.99 |
| 6/23/08 | 95.361 | 125.756 |
| 6/24/08 | 95.322 | 123.938 |
| 6/25/08 | 95.234 | 123.849 |
| 6/26/08 | 95.211 | 122.417 |
| 6/27/08 | 95.37 | 122.083 |
| 6/30/08 | 95.326 | 122.015 |
| 7/1/08 | 95.242 | 120.994 |
| 7/2/08 | 95.291 | 120.494 |
| 7/3/08 | 95.268 | 119.376 |
| 7/7/08 | 95.303 | 119.338 |
| 7/8/08 | 95.38 | 118.894 |
| 7/9/08 | 95.507 | 119.988 |
| 7/10/08 | 95.61 | 119.526 |
| 7/11/08 | 95.133 | 118.545 |
| 7/14/08 | 95.026 | 118.598 |
| 7/15/08 | 94.85 | 117.763 |
| 7/16/08 | 94.424 | 118.204 |
| 7/17/08 | 94.351 | 119.458 |
| 7/18/08 | 94.184 | 120.377 |
| 7/21/08 | 94.134 | 121.405 |
| 7/22/08 | 94.028 | 121.027 |
| 7/23/08 | 93.974 | 122.089 |
| 7/24/08 | 94.249 | 121.386 |
| 7/25/08 | 94.186 | 120.7 |
| 7/28/08 | 94.249 | 119.757 |
| 7/29/08 | 94.107 | 119.308 |
| 7/30/08 | 94.178 | 119.38 |
| 7/31/08 | 94.599 | 118.67 |
| 8/1/08 | 94.699 | 117.364 |
| 8/4/08 | 94.713 | 116.635 |
| 8/5/08 | 94.657 | 117.239 |
| 8/6/08 | 94.53 | 118.192 |
| 8/7/08 | 94.807 | 118.517 |
| 8/8/08 | 94.93 | 118.252 |
| 8/11/08 | 94.769 | 119.285 |
| 8/12/08 | 94.943 | 119.703 |
| 8/13/08 | 94.87 | 119.454 |
| 8/14/08 | 95.006 | 119.25 |
| 8/15/08 | 95.131 | 119.665 |
| 8/18/08 | 95.209 | 119.835 |
| 8/19/08 | 95.043 | 119.116 |
| 8/20/08 | 95.044 | 118.825 |
| 8/21/08 | 94.799 | 118.314 |
| 8/22/08 | 94.815 | 118.599 |
| 8/25/08 | 94.961 | 118.172 |
| 8/26/08 | 94.886 | 118.211 |
| 8/27/08 | 94.867 | 118.44 |
| 8/28/08 | 94.901 | 118.928 |
| 8/29/08 | 94.868 | 119 |
| 9/2/08 | 94.919 | 119.25 |
| 9/3/08 | 95.106 | 119.097 |
| 9/4/08 | 95.186 | 118.982 |
| 9/5/08 | 95.219 | 118.666 |
| 9/8/08 | 94.978 | 119.742 |
| 9/9/08 | 95.027 | 119.424 |
| 9/10/08 | 94.622 | 119.247 |
| 9/11/08 | 94.194 | 119.234 |
| 9/12/08 | 93.81 | 120.298 |
| 9/15/08 | 92.025 | 117.633 |
| 9/16/08 | 90.092 | 115.19 |
| 9/17/08 | 88.23 | 113.908 |
| 9/18/08 | 87.636 | 112.743 |
| 9/19/08 | 89.872 | 115.631 |
| 9/22/08 | 89.965 | 114.566 |
| 9/23/08 | 89.22 | 112.575 |
| 9/24/08 | 89.05 | 110.96 |
| 9/25/08 | 88.426 | 108.539 |
| 9/26/08 | 86.89 | 106.375 |
| 9/29/08 | 86.977 | 104.222 |
| 9/30/08 | 86.876 | 103.43 |
| 10/1/08 | 86.751 | 101.71 |
| 10/2/08 | 86.819 | 97.935 |
| 10/3/08 | 87.149 | 97.823 |
| 10/6/08 | 86.436 | 94.808 |
| 10/7/08 | 86.246 | 94.401 |
| 10/8/08 | 85.143 | 91.924 |
| 10/9/08 | 84.134 | 89.213 |
| 10/10/08 | 81.864 | 81.076 |
| 10/13/08 | 83.272 | 81.975 |
| 10/14/08 | 85.255 | 86.794 |
| 10/15/08 | 84.925 | 83.898 |
| 10/16/08 | 84.641 | 82.379 |
| 10/17/08 | 84.539 | 83.665 |
| 10/20/08 | 84.815 | 86.874 |
| 10/21/08 | 85.391 | 88.018 |
| 10/22/08 | 85.605 | 87.498 |
| 10/23/08 | 85.546 | 86.721 |
| 10/24/08 | 85.063 | 84.67 |
| 10/27/08 | 85.091 | 85.116 |
| 10/28/08 | 85.016 | 87.267 |
| 10/29/08 | 85.168 | 91.03 |
| 10/30/08 | 85.38 | 93.07 |
| 10/31/08 | 85.678 | 91.342 |
| 11/3/08 | 85.804 | 91.332 |
| 11/4/08 | 86.602 | 92.14 |
| 11/5/08 | 87.387 | 91.979 |
| 11/6/08 | 87.457 | 91.266 |
| 11/7/08 | 87.4 | 90.623 |
| 11/10/08 | 87.789 | 89.341 |
| 11/11/08 | 88.014 | 88.614 |
| 11/12/08 | 87.806 | 86.758 |
| 11/13/08 | 87.683 | 85.686 |
| 11/14/08 | 87.742 | 85.064 |
| 11/17/08 | 87.536 | 84.062 |
| 11/18/08 | 87.622 | 81.922 |
| 11/19/08 | 87.483 | 78.459 |
| 11/20/08 | 87.102 | 75.704 |
| 11/21/08 | 86.436 | 72.878 |
| 11/24/08 | 86.419 | 72.527 |
| 11/25/08 | 86.942 | 74.185 |
| 11/26/08 | 87.278 | 75.528 |
| 11/28/08 | 87.428 | 76.308 |
| 12/1/08 | 87.818 | 76.725 |
| 12/2/08 | 87.828 | 78.06 |
| 12/3/08 | 88.165 | 78.943 |
| 12/4/08 | 88.276 | 78.616 |
| 12/5/08 | 88.352 | 77.394 |
| 12/8/08 | 88.3 | 78.751 |
| 12/9/08 | 88.55 | 79.2 |
| 12/10/08 | 88.79 | 78.471 |
| 12/11/08 | 89.027 | 76.734 |
| 12/12/08 | 89 | 75.396 |
| 12/15/08 | 89.304 | 76.795 |
| 12/16/08 | 89.82 | 77.573 |
| 12/17/08 | 90.915 | 78.849 |
| 12/18/08 | 91.664 | 79.826 |
| 12/19/08 | 91.687 | 80.639 |
| 12/22/08 | 91.794 | 81.058 |
| 12/23/08 | 92.121 | 81.683 |
| 12/24/08 | 92.293 | 81.31 |
| 12/26/08 | 92.468 | 84.136 |
| 12/29/08 | 92.639 | 86.354 |
| 12/30/08 | 93.049 | 90.684 |
| 12/31/08 | 93.073 | 92.13 |
| 1/2/09 | 93.046 | 93.384 |
| 1/5/09 | 93.049 | 95.884 |
| 1/6/09 | 93.475 | 98.139 |
| 1/7/09 | 93.709 | 97.71 |
| 1/8/09 | 93.718 | 95.533 |
| 1/9/09 | 93.985 | 95.816 |
| 1/12/09 | 94.097 | 95.762 |
| 1/13/09 | 93.983 | 94.686 |
| 1/14/09 | 93.92 | 93.286 |
| 1/15/09 | 93.546 | 92.655 |
| 1/16/09 | 93.671 | 93.669 |
| 1/20/09 | 93.14 | 93.418 |
| 1/21/09 | 92.925 | 93.023 |
| 1/22/09 | 92.583 | 92.395 |
| 1/23/09 | 92.491 | 91.995 |
| 1/26/09 | 92.535 | 92.134 |
| 1/27/09 | 92.931 | 92.144 |
| 1/28/09 | 93.364 | 93.304 |
| 1/29/09 | 93.001 | 93.191 |
| 1/30/09 | 92.791 | 92.696 |
| 2/2/09 | 92.882 | 92.996 |
| 2/3/09 | 92.637 | 92.918 |
| 2/4/09 | 92.379 | 93.053 |
| 2/5/09 | 92.294 | 93.127 |
| 2/6/09 | 92.318 | 93.083 |
| 2/9/09 | 92.344 | 92.836 |
| 2/10/09 | 92.826 | 92.698 |
| 2/11/09 | 93.112 | 91.824 |
| 2/12/09 | 93.017 | 91.606 |
| 2/13/09 | 92.764 | 91.393 |
| 2/17/09 | 92.806 | 90.299 |
| 2/18/09 | 92.404 | 89.67 |
| 2/19/09 | 91.948 | 89.9 |
| 2/20/09 | 91.302 | 89.233 |
| 2/23/09 | 90.863 | 88.885 |
| 2/24/09 | 90.44 | 87.376 |
| 2/25/09 | 90.154 | 87.339 |
| 2/26/09 | 89.975 | 87.524 |
| 2/27/09 | 89.852 | 86.478 |
| 3/2/09 | 89.476 | 85.02 |
| 3/3/09 | 89.055 | 84.259 |
| 3/4/09 | 88.198 | 83.636 |
| 3/5/09 | 87.979 | 83.569 |
| 3/6/09 | 87.845 | 83.252 |
| 3/9/09 | 87.196 | 82.542 |
| 3/10/09 | 87.218 | 83.855 |
| 3/11/09 | 87.46 | 85.554 |
| 3/12/09 | 87.764 | 87.06 |
| 3/13/09 | 88.258 | 88.329 |
| 3/16/09 | 88.272 | 89.854 |
| 3/17/09 | 88.372 | 89.896 |
| 3/18/09 | 88.919 | 90.118 |
| 3/19/09 | 89.64 | 91.095 |
| 3/20/09 | 89.443 | 90.814 |
| 3/23/09 | 89.512 | 91.642 |
| 3/24/09 | 89.466 | 91.703 |
| 3/25/09 | 89.433 | 92.049 |
| 3/26/09 | 89.521 | 92.951 |
| 3/27/09 | 89.705 | 93.274 |
| 3/30/09 | 89.455 | 92.469 |
| 3/31/09 | 89.615 | 92.327 |
| 4/1/09 | 89.672 | 91.447 |
| 4/2/09 | 89.883 | 93.017 |
| 4/3/09 | 89.748 | 93.575 |
| 4/6/09 | 89.88 | 93.801 |
| 4/7/09 | 89.967 | 94.252 |
| 4/8/09 | 90.298 | 94.749 |
| 4/9/09 | 90.527 | 95.685 |
| 4/13/09 | 90.891 | 96.175 |
| 4/14/09 | 91.268 | 97.038 |
| 4/15/09 | 91.545 | 96.985 |
| 4/16/09 | 91.842 | 97.579 |
| 4/17/09 | 92.015 | 98.223 |
| 4/20/09 | 92.183 | 98.037 |
| 4/21/09 | 92.024 | 96.806 |
| 4/22/09 | 91.82 | 97.228 |
| 4/23/09 | 91.922 | 97.456 |
| 4/24/09 | 92.114 | 98.694 |
| 4/27/09 | 92.136 | 99.12 |
| 4/28/09 | 92.124 | 99.355 |
| 4/29/09 | 92.267 | 100.493 |
| 4/30/09 | 92.365 | 102.465 |
| 5/1/09 | 92.375 | 102.702 |
| 5/4/09 | 92.495 | 103.726 |
| 5/5/09 | 92.789 | 104.282 |
| 5/6/09 | 93.129 | 105.004 |
| 5/7/09 | 93.372 | 105.794 |
| 5/8/09 | 93.6 | 105.722 |
| 5/11/09 | 93.779 | 105.05 |
| 5/12/09 | 93.96 | 104.733 |
| 5/13/09 | 94.041 | 104.064 |
| 5/14/09 | 93.916 | 103.447 |
| 5/15/09 | 94.086 | 103.407 |
| 5/18/09 | 94 | 103.509 |
| 5/19/09 | 94.058 | 104.332 |
| 5/20/09 | 94.43 | 105.679 |
| 5/21/09 | 94.416 | 105.772 |
| 5/22/09 | 94.366 | 106.114 |
| 5/26/09 | 94.273 | 106.193 |
| 5/27/09 | 94.248 | 106.702 |
| 5/28/09 | 94.182 | 106.98 |
| 5/29/09 | 94.698 | 107.538 |
| 6/1/09 | 94.766 | 108.487 |
| 6/2/09 | 95.131 | 109.26 |
| 6/3/09 | 95.498 | 109.24 |
| 6/4/09 | 95.301 | 109.279 |
| 6/5/09 | 94.935 | 109.888 |
| 6/8/09 | 94.77 | 109.759 |
| 6/9/09 | 94.929 | 109.861 |
| 6/10/09 | 94.939 | 110.333 |
| 6/11/09 | 95.142 | 110.634 |
| 6/12/09 | 95.402 | 110.815 |
| 6/15/09 | 95.623 | 110.676 |
| 6/16/09 | 95.67 | 110.228 |
| 6/17/09 | 95.691 | 109.146 |
| 6/18/09 | 95.399 | 108.309 |
| 6/19/09 | 95.443 | 108.448 |
| 6/22/09 | 95.594 | 107.775 |
| 6/23/09 | 95.659 | 107.525 |
| 6/24/09 | 95.636 | 107.874 |
| 6/25/09 | 95.746 | 107.911 |
| 6/26/09 | 95.946 | 108.186 |
| 6/29/09 | 95.945 | 108.376 |
| 6/30/09 | 95.921 | 108.789 |
| 7/1/09 | 96.003 | 109.206 |
| 7/2/09 | 96.182 | 109.406 |
| 7/6/09 | 96.153 | 109.117 |
| 7/7/09 | 96.272 | 109.134 |
| 7/8/09 | 96.542 | 108.697 |
| 7/9/09 | 96.516 | 108.509 |
| 7/10/09 | 96.67 | 108.411 |
| 7/13/09 | 96.732 | 107.832 |
| 7/14/09 | 96.599 | 108.205 |
| 7/15/09 | 96.363 | 108.875 |
| 7/16/09 | 96.563 | 108.21 |
| 7/17/09 | 96.594 | 108.698 |
| 7/20/09 | 96.772 | 109.528 |
| 7/21/09 | 97.252 | 109.932 |
| 7/22/09 | 97.248 | 109.982 |
| 7/23/09 | 97.034 | 110.913 |
| 7/24/09 | 96.997 | 111.456 |
| 7/27/09 | 96.955 | 112.11 |
| 7/28/09 | 97.153 | 112.406 |
| 7/29/09 | 97.334 | 112.65 |
| 7/30/09 | 97.408 | 113.036 |
| 7/31/09 | 97.86 | 113.46 |
| 8/3/09 | 97.829 | 114.476 |
| 8/4/09 | 97.856 | 114.731 |
| 8/5/09 | 97.963 | 114.79 |
| 8/6/09 | 97.987 | 115.221 |
| 8/7/09 | 97.828 | 115.565 |
| 8/10/09 | 98.002 | 115.741 |
| 8/11/09 | 98.141 | 115.533 |
| 8/12/09 | 97.986 | 114.874 |
| 8/13/09 | 98.218 | 114.945 |
| 8/14/09 | 98.442 | 114.835 |
| 8/17/09 | 98.39 | 114.028 |
| 8/18/09 | 98.4 | 114.038 |
| 8/19/09 | 98.41 | 113.726 |
| 8/20/09 | 98.446 | 113.881 |
| 8/21/09 | 98.305 | 113.895 |
| 8/24/09 | 98.431 | 114.076 |
| 8/25/09 | 98.596 | 114.251 |
| 8/26/09 | 98.732 | 114.472 |
| 8/27/09 | 98.695 | 114.602 |
| 8/28/09 | 98.743 | 114.82 |
| 8/31/09 | 98.832 | 114.697 |
| 9/1/09 | 98.91 | 114.882 |
| 9/2/09 | 99.024 | 114.76 |
| 9/3/09 | 99.086 | 114.735 |
| 9/4/09 | 99.037 | 114.949 |
| 9/8/09 | 98.902 | 114.966 |
| 9/9/09 | 98.868 | 115.29 |
| 9/10/09 | 99.275 | 115.746 |
| 9/11/09 | 99.63 | 116.507 |
| 9/14/09 | 99.465 | 117.283 |
| 9/15/09 | 99.509 | 117.986 |
| 9/16/09 | 99.637 | 118.978 |
| 9/17/09 | 99.682 | 118.863 |
| 9/18/09 | 99.677 | 118.972 |
| 9/21/09 | 99.578 | 118.867 |
| 9/22/09 | 99.615 | 119.476 |
| 9/23/09 | 99.677 | 119.925 |
| 9/24/09 | 99.835 | 119.779 |
| 9/25/09 | 99.768 | 119.622 |
| 9/28/09 | 99.868 | 119.663 |
| 9/29/09 | 99.826 | 119.763 |
| 9/30/09 | 99.757 | 119.41 |
| 10/1/09 | 99.904 | 119.082 |
| 10/2/09 | 99.914 | 118.616 |
| 10/5/09 | 99.98 | 118.885 |
| 10/6/09 | 99.975 | 119.229 |
| 10/7/09 | 100.087 | 119.03 |
| 10/8/09 | 100.089 | 119.186 |
| 10/9/09 | 99.596 | 119.138 |
| 10/12/09 | 99.549 | 119.102 |
| 10/13/09 | 99.766 | 119.083 |
| 10/14/09 | 99.64 | 119.441 |
| 10/15/09 | 99.494 | 119.517 |
| 10/16/09 | 99.538 | 119.694 |
| 10/19/09 | 99.609 | 119.838 |
| 10/20/09 | 99.952 | 120.101 |
| 10/21/09 | 99.821 | 120.17 |
| 10/22/09 | 99.853 | 120.154 |
| 10/23/09 | 99.747 | 120.141 |
| 10/26/09 | 99.587 | 120.241 |
| 10/27/09 | 99.767 | 120.107 |
| 10/28/09 | 99.948 | 119.659 |
| 10/29/09 | 99.742 | 119.547 |
| 10/30/09 | 100 | 119.579 |
| 11/2/09 | 100.004 | 120.016 |
| 11/3/09 | 99.815 | 119.705 |
| 11/4/09 | 99.683 | 119.877 |
| 11/5/09 | 99.678 | 120.075 |
| 11/6/09 | 99.806 | 120.007 |
| 11/9/09 | 99.89 | 120.129 |
| 11/10/09 | 99.993 | 120.314 |
| 11/11/09 | 99.828 | 120.433 |
| 11/12/09 | 99.959 | 120.398 |
| 11/13/09 | 100.034 | 120.493 |
| 11/16/09 | 100.303 | 120.991 |
| 11/17/09 | 100.436 | 121.234 |
| 11/18/09 | 100.437 | 121.449 |
| 11/19/09 | 100.485 | 121.419 |
| 11/20/09 | 100.415 | 121.398 |
| 11/23/09 | 100.318 | 121.412 |
| 11/24/09 | 100.461 | 121.467 |
| 11/25/09 | 100.464 | 121.62 |
| 11/27/09 | 100.4 | 121.478 |
| 11/30/09 | 100.681 | 121.265 |
| 12/1/09 | 100.653 | 121.495 |
| 12/2/09 | 100.639 | 121.788 |
| 12/3/09 | 100.507 | 122.183 |
| 12/4/09 | 100.204 | 122.288 |
| 12/7/09 | 100.412 | 122.671 |
| 12/8/09 | 100.612 | 122.734 |
| 12/9/09 | 100.64 | 122.82 |
| 12/10/09 | 100.549 | 123.115 |
| 12/11/09 | 100.415 | 123.275 |
| 12/14/09 | 100.556 | 123.59 |
| 12/15/09 | 100.456 | 123.888 |
| 12/16/09 | 100.51 | 124.099 |
| 12/17/09 | 100.756 | 124.185 |
| 12/18/09 | 100.804 | 124.076 |
| 12/21/09 | 100.456 | 124.216 |
| 12/22/09 | 100.197 | 124.354 |
| 12/23/09 | 100.197 | 124.34 |
| 12/24/09 | 100.077 | 124.454 |
| 12/28/09 | 99.846 | 124.37 |
| 12/29/09 | 99.856 | 124.526 |
| 12/30/09 | 100.027 | 124.596 |
| 12/31/09 | 99.868 | 124.726 |
| 1/4/10 | 100.102 | 125.163 |
| 1/5/10 | 100.49 | 125.873 |
| 1/6/10 | 100.447 | 126.69 |
| 1/7/10 | 100.503 | 127.071 |
| 1/8/10 | 100.542 | 127.104 |
| 1/11/10 | 100.559 | 127.199 |
| 1/12/10 | 100.775 | 126.595 |
| 1/13/10 | 100.668 | 126.609 |
| 1/14/10 | 100.647 | 126.495 |
| 1/15/10 | 100.825 | 126.376 |
| 1/19/10 | 100.604 | 126.186 |
| 1/20/10 | 100.724 | 126.008 |
| 1/21/10 | 100.842 | 125.662 |
| 1/22/10 | 100.705 | 124.921 |
| 1/25/10 | 100.59 | 124.498 |
| 1/26/10 | 100.603 | 124.395 |
| 1/27/10 | 100.508 | 124.599 |
| 1/28/10 | 100.405 | 124.548 |
| 1/29/10 | 100.417 | 124.508 |
| 2/1/10 | 100.394 | 124.505 |
| 2/2/10 | 100.469 | 124.725 |
| 2/3/10 | 100.363 | 124.969 |
| 2/4/10 | 100.396 | 124.762 |
| 2/5/10 | 100.385 | 123.977 |
| 2/8/10 | 100.291 | 123.526 |
| 2/9/10 | 100.167 | 123.238 |
| 2/10/10 | 99.997 | 122.602 |
| 2/11/10 | 99.691 | 122.473 |
| 2/12/10 | 99.896 | 122.576 |
| 2/16/10 | 99.868 | 122.529 |
| 2/17/10 | 99.849 | 123.433 |
| 2/18/10 | 99.79 | 123.864 |
| 2/19/10 | 99.757 | 124.339 |
| 2/22/10 | 99.858 | 124.755 |
| 2/23/10 | 100.056 | 124.527 |
| 2/24/10 | 100.143 | 124.602 |
| 2/25/10 | 100.208 | 124.538 |
| 2/26/10 | 100.466 | 124.842 |
| 3/1/10 | 100.447 | 125.466 |
| 3/2/10 | 100.481 | 125.66 |
| 3/3/10 | 100.547 | 125.78 |
| 3/4/10 | 100.572 | 125.898 |
| 3/5/10 | 100.406 | 126.217 |
| 3/8/10 | 100.383 | 126.711 |
| 3/9/10 | 100.445 | 126.852 |
| 3/10/10 | 100.329 | 127.106 |
| 3/11/10 | 100.316 | 127.14 |
| 3/12/10 | 100.488 | 127.262 |
| 3/15/10 | 100.522 | 127.212 |
| 3/16/10 | 100.654 | 127.15 |
| 3/17/10 | 100.794 | 127.664 |
| 3/18/10 | 100.787 | 127.842 |
| 3/19/10 | 100.77 | 127.776 |
| 3/22/10 | 100.728 | 127.676 |
| 3/23/10 | 100.762 | 127.779 |
| 3/24/10 | 100.328 | 128.048 |
| 3/25/10 | 100.142 | 128.082 |
| 3/26/10 | 100.176 | 128.355 |
| 3/29/10 | 100.218 | 128.357 |
| 3/30/10 | 100.26 | 128.526 |
| 3/31/10 | 100.4 | 128.354 |
| 4/1/10 | 100.318 | 128.234 |
| 4/5/10 | 99.992 | 128.435 |
| 4/6/10 | 99.974 | 128.282 |
| 4/7/10 | 100.148 | 128.468 |
| 4/8/10 | 100.17 | 128.282 |
| 4/9/10 | 100.252 | 128.463 |
| 4/12/10 | 100.46 | 128.647 |
| 4/13/10 | 100.602 | 128.822 |
| 4/14/10 | 100.658 | 129.085 |
| 4/15/10 | 100.72 | 129.378 |
| 4/16/10 | 100.861 | 129.541 |
| 4/19/10 | 100.72 | 129.254 |
| 4/20/10 | 100.713 | 129.364 |
| 4/21/10 | 100.841 | 129.516 |
| 4/22/10 | 100.818 | 129.413 |
| 4/23/10 | 100.588 | 129.707 |
| 4/26/10 | 100.539 | 130.023 |
| 4/27/10 | 100.749 | 129.974 |
| 4/28/10 | 100.637 | 129.76 |
| 4/29/10 | 100.695 | 130.026 |
| 4/30/10 | 100.908 | 129.932 |
| 5/3/10 | 100.788 | 129.878 |
| 5/4/10 | 100.905 | 129.637 |
| 5/5/10 | 100.862 | 128.685 |
| 5/6/10 | 100.609 | 127.446 |
| 5/7/10 | 100.233 | 126.211 |
| 5/10/10 | 100.404 | 127.273 |
| 5/11/10 | 100.358 | 127.056 |
| 5/12/10 | 100.306 | 127.684 |
| 5/13/10 | 100.48 | 128.088 |
| 5/14/10 | 100.68 | 127.605 |
| 5/17/10 | 100.617 | 127.473 |
| 5/18/10 | 100.721 | 127.395 |
| 5/19/10 | 100.652 | 126.706 |
| 5/20/10 | 100.6 | 125.442 |
| 5/21/10 | 100.415 | 125.086 |
| 5/24/10 | 100.481 | 125.319 |
| 5/25/10 | 100.136 | 124.396 |
| 5/26/10 | 100.104 | 124.91 |
| 5/27/10 | 99.874 | 125.323 |
| 5/28/10 | 100.099 | 125.704 |
| 6/1/10 | 100.03 | 125.412 |
| 6/2/10 | 99.906 | 125.392 |
| 6/3/10 | 99.946 | 125.704 |
| 6/4/10 | 100.231 | 125.471 |
| 6/7/10 | 100.206 | 125.2 |
| 6/8/10 | 100.11 | 124.677 |
| 6/9/10 | 100.083 | 124.67 |
| 6/10/10 | 99.801 | 124.634 |
| 6/11/10 | 99.808 | 124.35 |
| 6/14/10 | 99.829 | 124.765 |
| 6/15/10 | 99.86 | 125.1 |
| 6/16/10 | 99.92 | 125.477 |
| 6/17/10 | 100.239 | 126.08 |
| 6/18/10 | 100.29 | 126.379 |
| 6/21/10 | 100.344 | 127.069 |
| 6/22/10 | 100.487 | 126.885 |
| 6/23/10 | 100.61 | 126.856 |
| 6/24/10 | 100.569 | 126.505 |
| 6/25/10 | 100.558 | 126.6 |
| 6/28/10 | 100.784 | 126.599 |
| 6/29/10 | 100.881 | 126.131 |
| 6/30/10 | 100.978 | 126.332 |
| 7/1/10 | 100.965 | 125.953 |
| 7/2/10 | 100.974 | 125.967 |
| 7/6/10 | 101.028 | 126.06 |
| 7/7/10 | 100.928 | 126.207 |
| 7/8/10 | 100.951 | 126.563 |
| 7/9/10 | 100.945 | 126.756 |
| 7/12/10 | 100.939 | 126.793 |
| 7/13/10 | 100.992 | 127.434 |
| 7/14/10 | 100.998 | 127.449 |
| 7/15/10 | 101.414 | 127.578 |
| 7/16/10 | 101.574 | 127.717 |
| 7/19/10 | 101.508 | 127.688 |
| 7/20/10 | 101.593 | 127.776 |
| 7/21/10 | 101.672 | 127.949 |
| 7/22/10 | 101.721 | 128.3 |
| 7/23/10 | 101.691 | 128.582 |
| 7/26/10 | 101.665 | 128.726 |
| 7/27/10 | 101.716 | 129.049 |
| 7/28/10 | 101.723 | 129.168 |
| 7/29/10 | 101.885 | 128.993 |
| 7/30/10 | 102.177 | 129.176 |
| 8/2/10 | 102.135 | 129.303 |
| 8/3/10 | 102.299 | 129.487 |
| 8/4/10 | 102.207 | 129.465 |
| 8/5/10 | 102.25 | 129.5 |
| 8/6/10 | 102.431 | 129.631 |
| 8/9/10 | 102.373 | 129.675 |
| 8/10/10 | 102.438 | 129.445 |
| 8/11/10 | 102.495 | 129.168 |
| 8/12/10 | 102.453 | 128.755 |
| 8/13/10 | 102.521 | 128.568 |
| 8/16/10 | 102.995 | 128.643 |
| 8/17/10 | 102.924 | 128.731 |
| 8/18/10 | 102.975 | 128.831 |
| 8/19/10 | 103.087 | 128.733 |
| 8/20/10 | 102.992 | 128.508 |
| 8/23/10 | 102.902 | 128.534 |
| 8/24/10 | 103.11 | 128.37 |
| 8/25/10 | 103.069 | 128.303 |
| 8/26/10 | 103.004 | 128.195 |
| 8/27/10 | 102.638 | 128.262 |
| 8/30/10 | 102.77 | 128.382 |
| 8/31/10 | 102.91 | 128.147 |
| 9/1/10 | 102.667 | 128.36 |
| 9/2/10 | 102.558 | 128.62 |
| 9/3/10 | 102.437 | 128.836 |
| 9/7/10 | 102.695 | 128.945 |
| 9/8/10 | 102.694 | 128.974 |
| 9/9/10 | 102.414 | 129.155 |
| 9/10/10 | 102.242 | 129.258 |
| 9/13/10 | 102.438 | 129.602 |
| 9/14/10 | 102.704 | 129.521 |
| 9/15/10 | 102.649 | 129.674 |
| 9/16/10 | 102.499 | 130.074 |
| 9/17/10 | 102.528 | 130.135 |
| 9/20/10 | 102.632 | 130.295 |
| 9/21/10 | 102.768 | 130.466 |
| 9/22/10 | 103.038 | 130.485 |
| 9/23/10 | 103.079 | 130.298 |
| 9/24/10 | 102.892 | 130.335 |
| 9/27/10 | 103.136 | 130.598 |
| 9/28/10 | 103.196 | 130.688 |
| 9/29/10 | 103.217 | 130.894 |
| 9/30/10 | 103.213 | 131.102 |
| 10/1/10 | 103.293 | 131.255 |
| 10/4/10 | 103.25 | 131.415 |
| 10/5/10 | 103.36 | 131.667 |
| 10/6/10 | 103.777 | 131.956 |
| 10/7/10 | 103.821 | 132.099 |
| 10/8/10 | 103.882 | 132.244 |
| 10/11/10 | 103.749 | 132.212 |
| 10/12/10 | 103.668 | 132.314 |
| 10/13/10 | 103.535 | 132.793 |
| 10/14/10 | 103.235 | 132.644 |
| 10/15/10 | 102.972 | 132.584 |
| 10/18/10 | 103.11 | 132.508 |
| 10/19/10 | 103.211 | 132.456 |
| 10/20/10 | 103.237 | 132.329 |
| 10/21/10 | 103.168 | 132.579 |
| 10/22/10 | 103.146 | 132.563 |
| 10/25/10 | 103.321 | 132.824 |
| 10/26/10 | 103.025 | 133.129 |
| 10/27/10 | 102.808 | 133.066 |
| 10/28/10 | 102.914 | 133.18 |
| 10/29/10 | 103.11 | 133.087 |
| 11/1/10 | 103.142 | 133.192 |
| 11/2/10 | 103.332 | 132.962 |
| 11/3/10 | 103.438 | 133.19 |
| 11/4/10 | 103.58 | 133.536 |
| 11/5/10 | 103.406 | 133.536 |
| 11/8/10 | 103.31 | 133.557 |
| 11/9/10 | 103.055 | 133.593 |
| 11/10/10 | 102.564 | 133.022 |
| 11/11/10 | 102.616 | 132.97 |
| 11/12/10 | 102.468 | 132.524 |
| 11/15/10 | 102.045 | 132.371 |
| 11/16/10 | 101.932 | 131.763 |
| 11/17/10 | 102.112 | 131.511 |
| 11/18/10 | 101.897 | 131.639 |
| 11/19/10 | 102.054 | 131.122 |
| 11/22/10 | 102.165 | 131.019 |
| 11/23/10 | 102.278 | 130.588 |
| 11/24/10 | 101.864 | 130.542 |
| 11/26/10 | 101.863 | 130.744 |
| 11/29/10 | 101.922 | 130.291 |
| 11/30/10 | 102.022 | 130.145 |
| 12/1/10 | 101.568 | 130.481 |
| 12/2/10 | 101.476 | 130.838 |
| 12/3/10 | 101.519 | 130.961 |
| 12/6/10 | 101.694 | 131.045 |
| 12/7/10 | 101.352 | 131.156 |
| 12/8/10 | 100.876 | 130.842 |
| 12/9/10 | 100.991 | 130.879 |
| 12/10/10 | 100.934 | 130.643 |
| 12/13/10 | 100.857 | 130.642 |
| 12/14/10 | 100.596 | 130.565 |
| 12/15/10 | 100.33 | 130.335 |
| 12/16/10 | 100.307 | 130.398 |
| 12/17/10 | 100.602 | 130.396 |
| 12/20/10 | 100.943 | 130.42 |
| 12/21/10 | 100.841 | 130.656 |
| 12/22/10 | 100.868 | 130.633 |
| 12/23/10 | 100.766 | 130.815 |
| 12/27/10 | 100.627 | 130.708 |
| 12/28/10 | 100.526 | 130.99 |
| 12/29/10 | 100.688 | 131.074 |
| 12/30/10 | 100.846 | 131.261 |
| 12/31/10 | 101.042 | 131.455 |